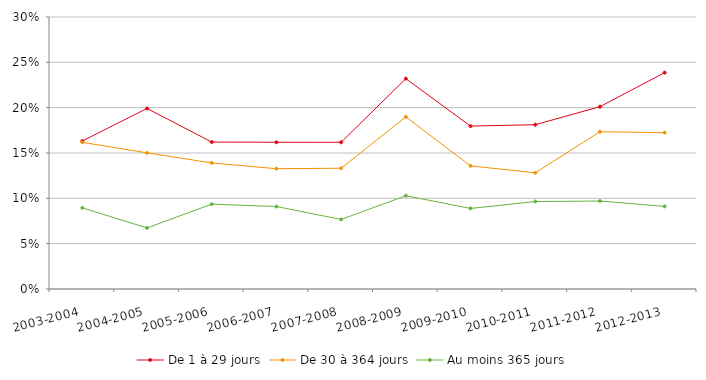
| Category | De 1 à 29 jours | De 30 à 364 jours | Au moins 365 jours |
|---|---|---|---|
| 2003-2004 | 0.163 | 0.162 | 0.089 |
| 2004-2005 | 0.199 | 0.15 | 0.067 |
| 2005-2006 | 0.162 | 0.139 | 0.094 |
| 2006-2007 | 0.162 | 0.133 | 0.091 |
| 2007-2008 | 0.162 | 0.133 | 0.077 |
| 2008-2009 | 0.232 | 0.19 | 0.103 |
| 2009-2010 | 0.18 | 0.136 | 0.089 |
| 2010-2011 | 0.181 | 0.128 | 0.096 |
| 2011-2012 | 0.201 | 0.173 | 0.097 |
| 2012-2013 | 0.239 | 0.172 | 0.091 |